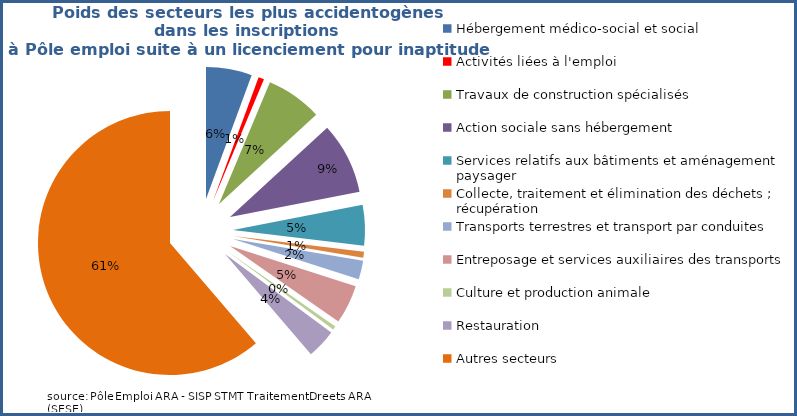
| Category | Femmes | Hommes | Total |
|---|---|---|---|
| Hébergement médico-social et social | 0.087 | 0.017 | 0.056 |
| Activités liées à l'emploi | 0.007 | 0.007 | 0.007 |
| Travaux de construction spécialisés | 0.009 | 0.144 | 0.069 |
| Action sociale sans hébergement | 0.145 | 0.015 | 0.088 |
| Services relatifs aux bâtiments et aménagement paysager | 0.061 | 0.035 | 0.05 |
| Collecte, traitement et élimination des déchets ; récupération | 0.002 | 0.014 | 0.007 |
| Transports terrestres et transport par conduites | 0.015 | 0.033 | 0.023 |
| Entreposage et services auxiliaires des transports | 0.017 | 0.087 | 0.048 |
| Culture et production animale | 0.003 | 0.006 | 0.004 |
| Restauration | 0.042 | 0.028 | 0.036 |
| Autres secteurs | 0.611 | 0.615 | 0.613 |